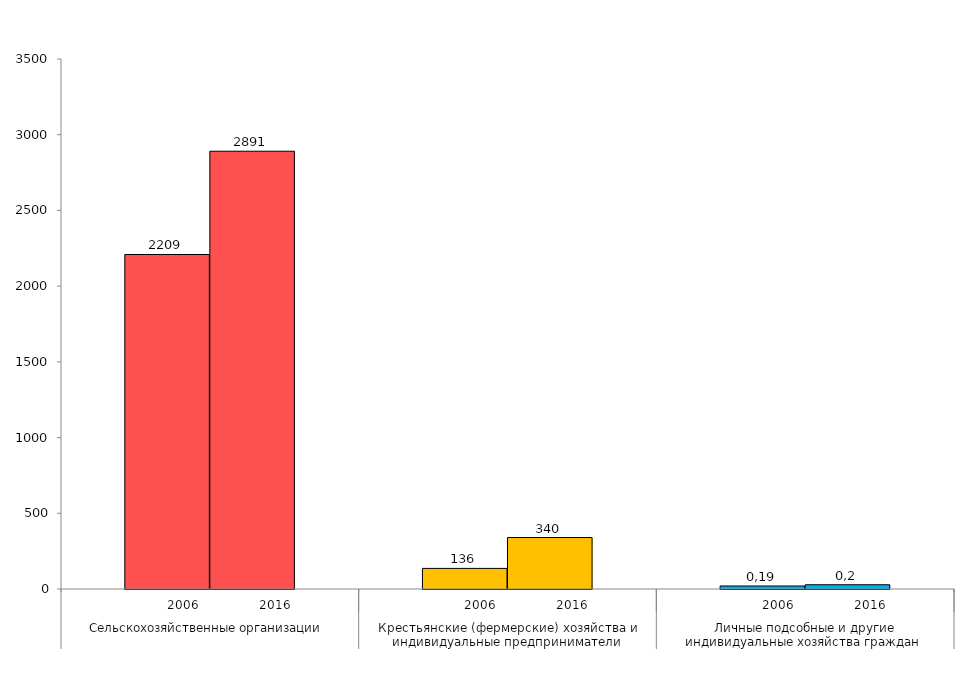
| Category | Series 2 | Series 3 |
|---|---|---|
| 0 | 2209 | 2891 |
| 1 | 136 | 340 |
| 2 | 20 | 28 |